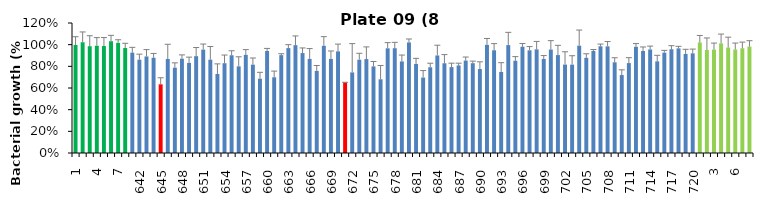
| Category | 8 h % |
|---|---|
| 1.0 | 0.997 |
| 2.0 | 1.022 |
| 3.0 | 0.986 |
| 4.0 | 0.99 |
| 5.0 | 0.987 |
| 6.0 | 1.032 |
| 7.0 | 1.017 |
| 8.0 | 0.969 |
| 641.0 | 0.927 |
| 642.0 | 0.861 |
| 643.0 | 0.891 |
| 644.0 | 0.879 |
| 645.0 | 0.634 |
| 646.0 | 0.868 |
| 647.0 | 0.788 |
| 648.0 | 0.871 |
| 649.0 | 0.832 |
| 650.0 | 0.894 |
| 651.0 | 0.954 |
| 652.0 | 0.861 |
| 653.0 | 0.73 |
| 654.0 | 0.829 |
| 655.0 | 0.902 |
| 656.0 | 0.8 |
| 657.0 | 0.906 |
| 658.0 | 0.816 |
| 659.0 | 0.686 |
| 660.0 | 0.941 |
| 661.0 | 0.699 |
| 662.0 | 0.903 |
| 663.0 | 0.968 |
| 664.0 | 0.995 |
| 665.0 | 0.922 |
| 666.0 | 0.869 |
| 667.0 | 0.758 |
| 668.0 | 0.99 |
| 669.0 | 0.869 |
| 670.0 | 0.938 |
| 671.0 | 0.65 |
| 672.0 | 0.744 |
| 673.0 | 0.861 |
| 674.0 | 0.867 |
| 675.0 | 0.799 |
| 676.0 | 0.68 |
| 677.0 | 0.966 |
| 678.0 | 0.967 |
| 679.0 | 0.845 |
| 680.0 | 1.021 |
| 681.0 | 0.822 |
| 682.0 | 0.696 |
| 683.0 | 0.791 |
| 684.0 | 0.9 |
| 685.0 | 0.828 |
| 686.0 | 0.793 |
| 687.0 | 0.808 |
| 688.0 | 0.853 |
| 689.0 | 0.829 |
| 690.0 | 0.775 |
| 691.0 | 0.998 |
| 692.0 | 0.948 |
| 693.0 | 0.748 |
| 694.0 | 0.996 |
| 695.0 | 0.852 |
| 696.0 | 0.981 |
| 697.0 | 0.948 |
| 698.0 | 0.957 |
| 699.0 | 0.868 |
| 700.0 | 0.955 |
| 701.0 | 0.904 |
| 702.0 | 0.816 |
| 703.0 | 0.816 |
| 704.0 | 0.991 |
| 705.0 | 0.879 |
| 706.0 | 0.943 |
| 707.0 | 0.985 |
| 708.0 | 0.984 |
| 709.0 | 0.837 |
| 710.0 | 0.72 |
| 711.0 | 0.83 |
| 712.0 | 0.981 |
| 713.0 | 0.941 |
| 714.0 | 0.956 |
| 715.0 | 0.846 |
| 716.0 | 0.926 |
| 717.0 | 0.958 |
| 718.0 | 0.966 |
| 719.0 | 0.915 |
| 720.0 | 0.92 |
| 1.0 | 1.021 |
| 2.0 | 0.95 |
| 3.0 | 0.955 |
| 4.0 | 1.012 |
| 5.0 | 0.973 |
| 6.0 | 0.955 |
| 7.0 | 0.967 |
| 8.0 | 0.983 |